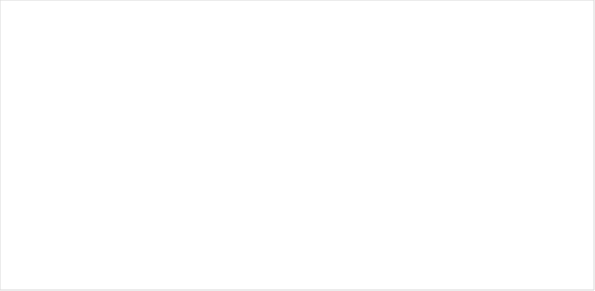
| Category | RESERVAS CONSTITUIDAS
 | CANCELACIONES RESERVAS PRESUPUESTALES
  | PAGOS
ACUMULADOS
 |
|---|---|---|---|
| A-FUNCIONAMIENTO | 2249.649 | 0 | 2226.876 |
| C-INVERSIÓN | 53197.266 | 1008.219 | 41374.925 |